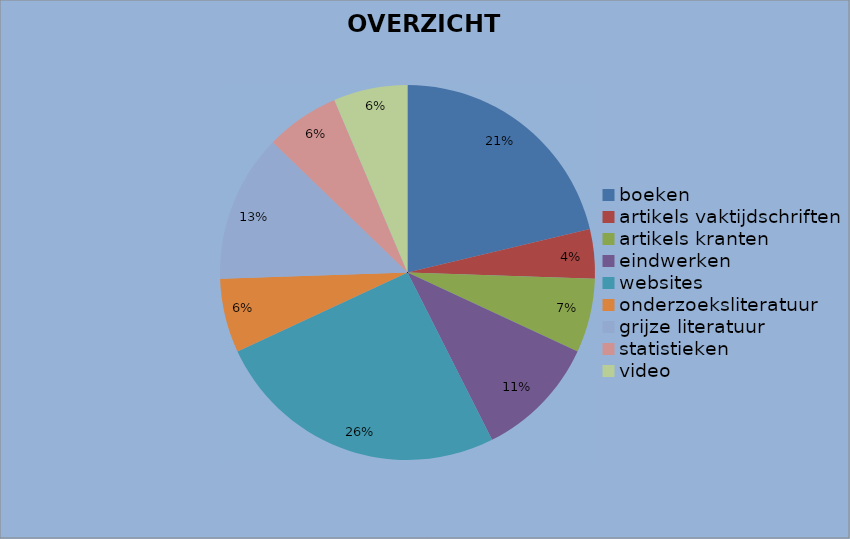
| Category | AANTAL |
|---|---|
| boeken | 10 |
| artikels vaktijdschriften | 2 |
| artikels kranten | 3 |
| eindwerken | 5 |
| websites | 12 |
| onderzoeksliteratuur | 3 |
| grijze literatuur | 6 |
| statistieken | 3 |
| video | 3 |